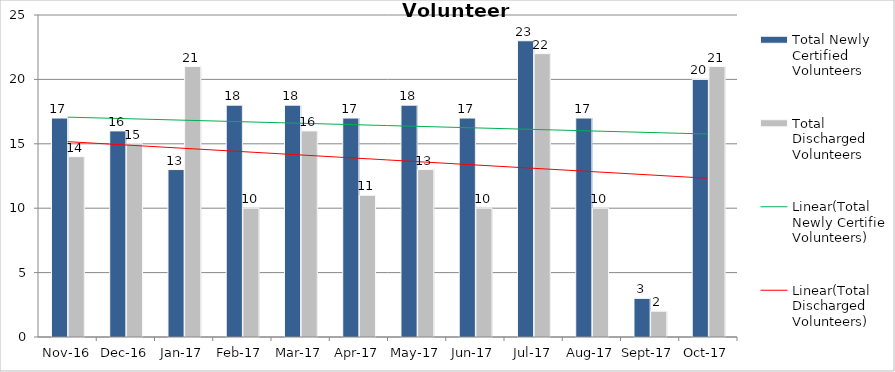
| Category | Total Newly Certified Volunteers | Total Discharged Volunteers |
|---|---|---|
| 2016-11-01 | 17 | 14 |
| 2016-12-01 | 16 | 15 |
| 2017-01-01 | 13 | 21 |
| 2017-02-01 | 18 | 10 |
| 2017-03-01 | 18 | 16 |
| 2017-04-01 | 17 | 11 |
| 2017-05-01 | 18 | 13 |
| 2017-06-01 | 17 | 10 |
| 2017-07-01 | 23 | 22 |
| 2017-08-01 | 17 | 10 |
| 2017-09-01 | 3 | 2 |
| 2017-10-01 | 20 | 21 |